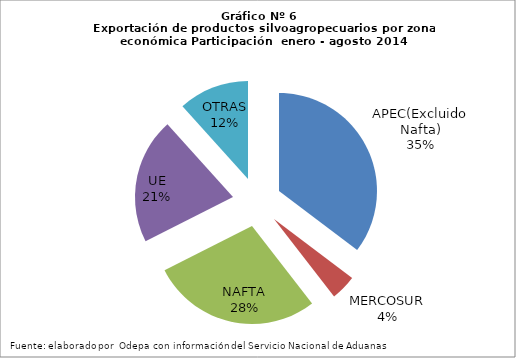
| Category | Series 0 |
|---|---|
| APEC(Excluido Nafta) | 3923352.429 |
| MERCOSUR | 465983.325 |
| NAFTA | 3116720.843 |
| UE | 2310030.453 |
| OTRAS | 1296065.949 |